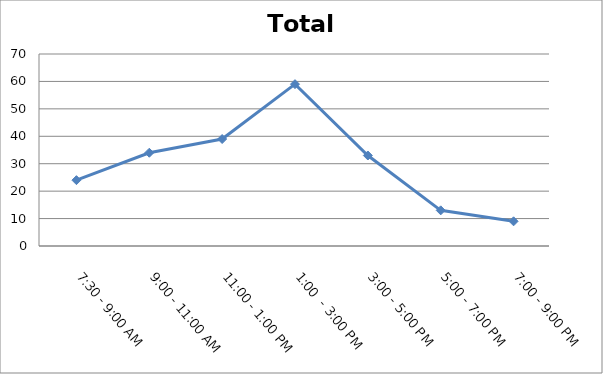
| Category | Total |
|---|---|
| 7:30 - 9:00 AM | 24 |
| 9:00 - 11:00 AM | 34 |
| 11:00 - 1:00 PM | 39 |
| 1:00  - 3:00 PM | 59 |
| 3:00 - 5:00 PM | 33 |
| 5:00 - 7:00 PM | 13 |
| 7:00 - 9:00 PM | 9 |